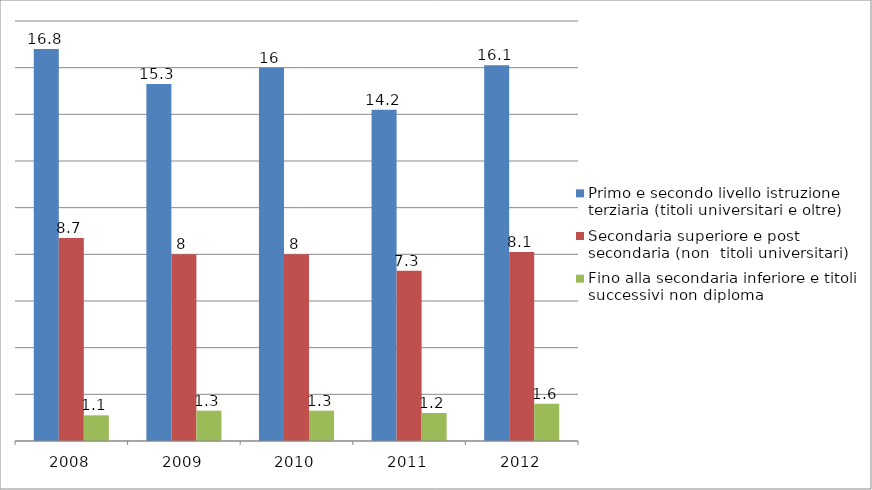
| Category | Primo e secondo livello istruzione terziaria (titoli universitari e oltre) | Secondaria superiore e post secondaria (non  titoli universitari) | Fino alla secondaria inferiore e titoli successivi non diploma |
|---|---|---|---|
| 2008 | 16.8 | 8.7 | 1.1 |
| 2009 | 15.3 | 8 | 1.3 |
| 2010 | 16 | 8 | 1.3 |
| 2011 | 14.2 | 7.3 | 1.2 |
| 2012 | 16.1 | 8.1 | 1.6 |